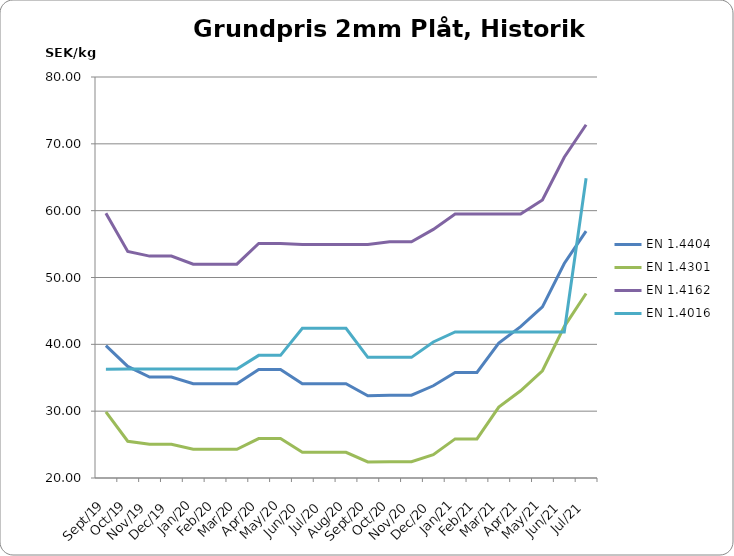
| Category | EN 1.4404 | EN 1.4301 | EN 1.4162  | EN 1.4016 |
|---|---|---|---|---|
| 2019-09-15 | 39.8 | 29.9 | 59.6 | 36.29 |
| 2019-10-15 | 36.7 | 25.5 | 53.9 | 36.3 |
| 2019-11-15 | 35.1 | 25.05 | 53.2 | 36.3 |
| 2019-12-15 | 35.1 | 25.05 | 53.2 | 36.3 |
| 2020-01-15 | 34.1 | 24.3 | 52 | 36.3 |
| 2020-02-15 | 34.1 | 24.3 | 52 | 36.3 |
| 2020-03-15 | 34.1 | 24.3 | 52 | 36.3 |
| 2020-04-26 | 36.25 | 25.9 | 55.1 | 38.35 |
| 2020-05-26 | 36.25 | 25.9 | 55.1 | 38.35 |
| 2020-06-26 | 34.1 | 23.85 | 54.95 | 42.4 |
| 2020-07-26 | 34.1 | 23.85 | 54.95 | 42.4 |
| 2020-08-26 | 34.1 | 23.85 | 54.95 | 42.4 |
| 2020-09-26 | 32.3 | 22.4 | 54.95 | 38.05 |
| 2020-10-26 | 32.4 | 22.45 | 55.35 | 38.05 |
| 2020-11-26 | 32.4 | 22.45 | 55.35 | 38.05 |
| 2020-12-26 | 33.8 | 23.5 | 57.2 | 40.35 |
| 2021-01-26 | 35.8 | 25.85 | 59.5 | 41.85 |
| 2021-02-26 | 35.8 | 25.85 | 59.5 | 41.85 |
| 2021-03-26 | 40.2 | 30.6 | 59.5 | 41.85 |
| 2021-04-26 | 42.65 | 33.05 | 59.5 | 41.85 |
| 2021-05-26 | 45.6 | 36.05 | 61.6 | 41.85 |
| 2021-06-26 | 52.1 | 42.65 | 68 | 41.85 |
| 2021-07-26 | 56.95 | 47.6 | 72.85 | 64.85 |